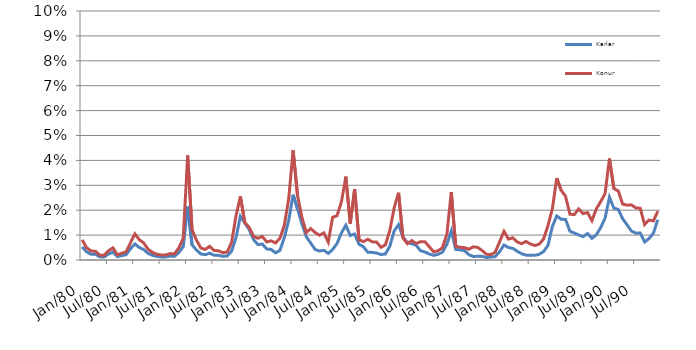
| Category | Karlar | Konur |
|---|---|---|
| 1980-01-01 | 0.528 | 0.807 |
| 1980-02-01 | 0.325 | 0.498 |
| 1980-03-01 | 0.234 | 0.359 |
| 1980-04-01 | 0.23 | 0.353 |
| 1980-05-01 | 0.126 | 0.193 |
| 1980-06-01 | 0.125 | 0.191 |
| 1980-07-01 | 0.242 | 0.372 |
| 1980-08-01 | 0.317 | 0.486 |
| 1980-09-01 | 0.136 | 0.209 |
| 1980-10-01 | 0.175 | 0.268 |
| 1980-11-01 | 0.215 | 0.33 |
| 1980-12-01 | 0.454 | 0.695 |
| 1981-01-01 | 0.645 | 1.05 |
| 1981-02-01 | 0.5 | 0.814 |
| 1981-03-01 | 0.42 | 0.684 |
| 1981-04-01 | 0.265 | 0.432 |
| 1981-05-01 | 0.186 | 0.303 |
| 1981-06-01 | 0.141 | 0.23 |
| 1981-07-01 | 0.121 | 0.198 |
| 1981-08-01 | 0.124 | 0.202 |
| 1981-09-01 | 0.157 | 0.256 |
| 1981-10-01 | 0.148 | 0.242 |
| 1981-11-01 | 0.301 | 0.491 |
| 1981-12-01 | 0.54 | 0.88 |
| 1982-01-01 | 2.146 | 4.2 |
| 1982-02-01 | 0.611 | 1.214 |
| 1982-03-01 | 0.401 | 0.798 |
| 1982-04-01 | 0.243 | 0.484 |
| 1982-05-01 | 0.212 | 0.424 |
| 1982-06-01 | 0.275 | 0.548 |
| 1982-07-01 | 0.192 | 0.384 |
| 1982-08-01 | 0.186 | 0.371 |
| 1982-09-01 | 0.147 | 0.294 |
| 1982-10-01 | 0.161 | 0.321 |
| 1982-11-01 | 0.356 | 0.709 |
| 1982-12-01 | 0.893 | 1.769 |
| 1983-01-01 | 1.756 | 2.554 |
| 1983-02-01 | 1.485 | 1.511 |
| 1983-03-01 | 1.221 | 1.311 |
| 1983-04-01 | 0.817 | 0.946 |
| 1983-05-01 | 0.619 | 0.872 |
| 1983-06-01 | 0.64 | 0.943 |
| 1983-07-01 | 0.442 | 0.725 |
| 1983-08-01 | 0.426 | 0.77 |
| 1983-09-01 | 0.287 | 0.684 |
| 1983-10-01 | 0.387 | 0.875 |
| 1983-11-01 | 0.902 | 1.394 |
| 1983-12-01 | 1.59 | 2.462 |
| 1984-01-01 | 2.621 | 4.414 |
| 1984-02-01 | 2.058 | 2.596 |
| 1984-03-01 | 1.457 | 1.719 |
| 1984-04-01 | 0.933 | 1.103 |
| 1984-05-01 | 0.682 | 1.263 |
| 1984-06-01 | 0.425 | 1.106 |
| 1984-07-01 | 0.36 | 0.994 |
| 1984-08-01 | 0.388 | 1.088 |
| 1984-09-01 | 0.265 | 0.717 |
| 1984-10-01 | 0.422 | 1.715 |
| 1984-11-01 | 0.662 | 1.779 |
| 1984-12-01 | 1.087 | 2.336 |
| 1985-01-01 | 1.397 | 3.35 |
| 1985-02-01 | 0.982 | 1.459 |
| 1985-03-01 | 1.045 | 2.847 |
| 1985-04-01 | 0.635 | 0.814 |
| 1985-05-01 | 0.532 | 0.736 |
| 1985-06-01 | 0.308 | 0.833 |
| 1985-07-01 | 0.306 | 0.729 |
| 1985-08-01 | 0.279 | 0.721 |
| 1985-09-01 | 0.219 | 0.508 |
| 1985-10-01 | 0.24 | 0.611 |
| 1985-11-01 | 0.55 | 1.176 |
| 1985-12-01 | 1.163 | 2.095 |
| 1986-01-01 | 1.421 | 2.7 |
| 1986-02-01 | 0.929 | 0.883 |
| 1986-03-01 | 0.702 | 0.655 |
| 1986-04-01 | 0.651 | 0.782 |
| 1986-05-01 | 0.591 | 0.664 |
| 1986-06-01 | 0.374 | 0.737 |
| 1986-07-01 | 0.322 | 0.735 |
| 1986-08-01 | 0.24 | 0.532 |
| 1986-09-01 | 0.186 | 0.325 |
| 1986-10-01 | 0.228 | 0.373 |
| 1986-11-01 | 0.316 | 0.5 |
| 1986-12-01 | 0.631 | 1.041 |
| 1987-01-01 | 1.174 | 2.725 |
| 1987-02-01 | 0.427 | 0.565 |
| 1987-03-01 | 0.406 | 0.509 |
| 1987-04-01 | 0.38 | 0.498 |
| 1987-05-01 | 0.214 | 0.431 |
| 1987-06-01 | 0.141 | 0.529 |
| 1987-07-01 | 0.149 | 0.506 |
| 1987-08-01 | 0.15 | 0.384 |
| 1987-09-01 | 0.098 | 0.227 |
| 1987-10-01 | 0.122 | 0.217 |
| 1987-11-01 | 0.135 | 0.313 |
| 1987-12-01 | 0.333 | 0.733 |
| 1988-01-01 | 0.604 | 1.152 |
| 1988-02-01 | 0.5 | 0.839 |
| 1988-03-01 | 0.468 | 0.891 |
| 1988-04-01 | 0.352 | 0.727 |
| 1988-05-01 | 0.252 | 0.654 |
| 1988-06-01 | 0.196 | 0.746 |
| 1988-07-01 | 0.191 | 0.642 |
| 1988-08-01 | 0.188 | 0.582 |
| 1988-09-01 | 0.226 | 0.635 |
| 1988-10-01 | 0.339 | 0.842 |
| 1988-11-01 | 0.583 | 1.378 |
| 1988-12-01 | 1.343 | 2.058 |
| 1989-01-01 | 1.766 | 3.285 |
| 1989-02-01 | 1.639 | 2.804 |
| 1989-03-01 | 1.627 | 2.56 |
| 1989-04-01 | 1.157 | 1.838 |
| 1989-05-01 | 1.082 | 1.825 |
| 1989-06-01 | 1.008 | 2.053 |
| 1989-07-01 | 0.938 | 1.864 |
| 1989-08-01 | 1.063 | 1.906 |
| 1989-09-01 | 0.871 | 1.579 |
| 1989-10-01 | 1.011 | 2.051 |
| 1989-11-01 | 1.301 | 2.344 |
| 1989-12-01 | 1.683 | 2.669 |
| 1990-01-01 | 2.524 | 4.075 |
| 1990-02-01 | 2.082 | 2.869 |
| 1990-03-01 | 2.03 | 2.772 |
| 1990-04-01 | 1.657 | 2.244 |
| 1990-05-01 | 1.414 | 2.203 |
| 1990-06-01 | 1.161 | 2.214 |
| 1990-07-01 | 1.079 | 2.091 |
| 1990-08-01 | 1.08 | 2.08 |
| 1990-09-01 | 0.724 | 1.425 |
| 1990-10-01 | 0.863 | 1.603 |
| 1990-11-01 | 1.077 | 1.572 |
| 1990-12-01 | 1.617 | 1.961 |